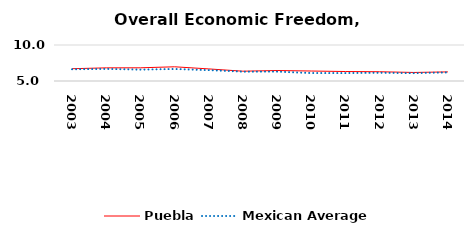
| Category | Puebla | Mexican Average  |
|---|---|---|
| 2003.0 | 6.705 | 6.632 |
| 2004.0 | 6.826 | 6.678 |
| 2005.0 | 6.833 | 6.582 |
| 2006.0 | 6.973 | 6.668 |
| 2007.0 | 6.679 | 6.508 |
| 2008.0 | 6.362 | 6.3 |
| 2009.0 | 6.455 | 6.3 |
| 2010.0 | 6.385 | 6.105 |
| 2011.0 | 6.317 | 6.103 |
| 2012.0 | 6.287 | 6.144 |
| 2013.0 | 6.185 | 6.087 |
| 2014.0 | 6.264 | 6.195 |